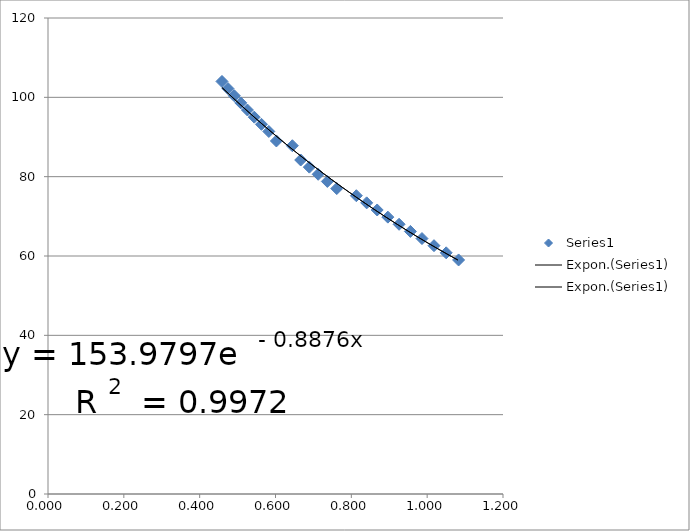
| Category | Series 0 |
|---|---|
| 1.08285407148616 | 59 |
| 1.050204526861194 | 60.8 |
| 1.018000138303022 | 62.6 |
| 0.986321250788754 | 64.4 |
| 0.955750515024508 | 66.2 |
| 0.925899280575539 | 68 |
| 0.896328938742807 | 69.8 |
| 0.868165070007369 | 71.6 |
| 0.840433778042781 | 73.4 |
| 0.813187641296157 | 75.2 |
| 0.761538461538461 | 77 |
| 0.736694112164051 | 78.8 |
| 0.712576446604987 | 80.6 |
| 0.689240506329114 | 82.4 |
| 0.666552018577778 | 84.2 |
| 0.644491832300636 | 87.8 |
| 0.602356759231253 | 89 |
| 0.582362532838119 | 91.4 |
| 0.563023446765806 | 93.2 |
| 0.544028728912644 | 95 |
| 0.52595830531271 | 96.8 |
| 0.508358006936807 | 98.6 |
| 0.4912503191761 | 100.4 |
| 0.474657534246575 | 102.2 |
| 0.458821858130505 | 104 |